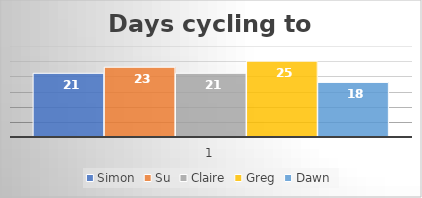
| Category | Simon | Su | Claire | Greg | Dawn |
|---|---|---|---|---|---|
| 0 | 21 | 23 | 21 | 25 | 18 |